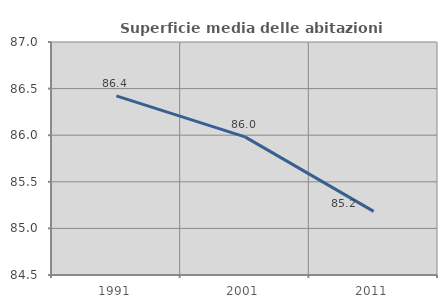
| Category | Superficie media delle abitazioni occupate |
|---|---|
| 1991.0 | 86.422 |
| 2001.0 | 85.982 |
| 2011.0 | 85.183 |